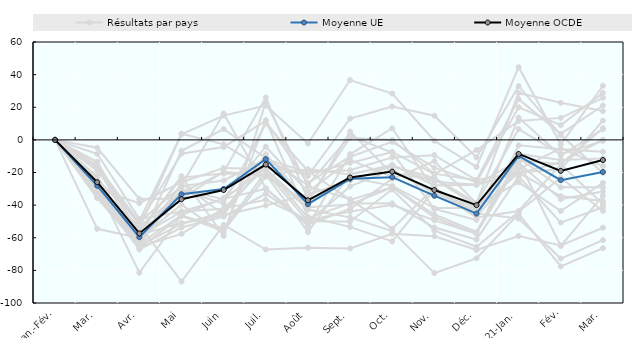
| Category | Australie | Canada | Royaume-Uni | États-Unis | Autriche | Bulgarie  | Chypre  | République tchèque  | Allemagne  | Danemark  | Estonie  | Grèce  | Espagne  | France  | Croatie  | Irlande  | Italie  | Lituanie  | Luxembourg  | Lettonie  | Pays-Bas  | Pologne  | Roumanie  | Slovénie  | Résultats par pays | Moyenne UE | Moyenne OCDE |
|---|---|---|---|---|---|---|---|---|---|---|---|---|---|---|---|---|---|---|---|---|---|---|---|---|---|---|---|
| 2020-Jan.-Fév. | 0 | 0 | 0 | 0 | 0 | 0 | 0 | 0 | 0 | 0 | 0 | 0 | 0 | 0 | 0 | 0 | 0 | 0 | 0 | 0 | 0 | 0 | 0 | 0 | 0 | 0 | 0 |
| Mar. | -8.517 | -15.927 | -13.625 | -4.853 | -32.585 | -22.38 | -16.806 | -30.191 | -16.004 | -18.932 | -33.764 | -30.013 | -33.271 | -24.479 | -28.477 | -32.853 | -31.774 | -35.192 | -30.586 | -29.103 | -17.11 | -13.515 | -23.129 | -54.517 | -35.642 | -28.111 | -25.951 |
| Avr. | -48.58 | -50.371 | -58.131 | -36.223 | -67.198 | -62.933 | -56.655 | -38.826 | -63.654 | -52.296 | -54.117 | -53.3 | -59.061 | -49.755 | -81.395 | -64.882 | -56.43 | -60.726 | -63.95 | -66.445 | -51.151 | -59.943 | -64.165 | -60.168 | -65.585 | -59.649 | -57.372 |
| Mai | -43.848 | -28.403 | -50.953 | -35.984 | -53.715 | -6.662 | -22.269 | -26.007 | -26.798 | -86.829 | 3.736 | -32.442 | -44.012 | 3.437 | -46.278 | -51.517 | -23.114 | -31.008 | -46.079 | -46.687 | -8.479 | -27.867 | -30.459 | -39.725 | -57.62 | -33.352 | -36.372 |
| Juin | -42.218 | -24.914 | -46.03 | -19.547 | -46.999 | 6.621 | -58.959 | -17.196 | -45.724 | -52.052 | -2.751 | -19.873 | -36.155 | 14.881 | -54.271 | -44.408 | -20.64 | -39.015 | -35.704 | -55.682 | -4.416 | 16.185 | -36.347 | -57.385 | -42.143 | -30.097 | -30.73 |
| Juil. | -16.625 | -11.821 | -40.209 | -21.936 | -33.049 | -11.21 | 23.074 | -17.871 | -13.402 | -67.199 | -18.763 | 26.004 | -29.991 | 21.038 | -19.646 | -8.775 | -21.155 | 10.041 | -4.182 | -22.529 | 11.688 | -29.68 | -17.164 | 12.038 | -36.726 | -11.784 | -15.125 |
| Août | -20.883 | -19.993 | -33.6 | -17.876 | -50.552 | -27.645 | -28.376 | -41.346 | -22.104 | -66.144 | -42.747 | -36.805 | -52.799 | -2.25 | -49.916 | -38.129 | -56.502 | -19.081 | -31.937 | -38.47 | -26.401 | -51.803 | -47.828 | -47.273 | -49.198 | -39.396 | -37.082 |
| Sept. | -14.131 | -18.555 | -24.805 | -21.29 | -28.525 | 2.462 | -36.384 | -39.587 | 13.005 | -66.517 | -47.499 | 1.282 | -8.835 | 36.664 | -50.093 | 5.123 | -20.875 | -36.779 | -12.423 | -23.054 | -10.349 | -42.394 | -38.948 | -53.334 | -43.987 | -23.859 | -23.044 |
| Oct. | -7.419 | -10.729 | -16.018 | -15.294 | -18.22 | -7.765 | -54.415 | -29.049 | 20.437 | -57.527 | -55.877 | -0.035 | 7.128 | 28.416 | -30.413 | -20.688 | -16.018 | -29.01 | -22.545 | -28.2 | -1.228 | -23.963 | -38.915 | -62.224 | -39.806 | -22.853 | -19.467 |
| Nov. | -20.921 | -9.358 | -25.618 | -27.918 | -32.558 | -42.283 | -29.359 | -47.55 | 14.779 | -59.081 | -81.663 | -20.718 | -30.244 | -0.524 | -55.62 | -24.145 | -23.347 | -45.762 | -34.431 | -41.826 | -17.06 | -13.055 | -53.742 | -30.774 | -49.321 | -34.204 | -30.76 |
| Déc. | -6.255 | -24.648 | -27.489 | -27.488 | -41.527 | -49.094 | -45.069 | -57.446 | -10.749 | -67.551 | -72.589 | -24.674 | -46.87 | -16.59 | -65.534 | -40.29 | -38.794 | -56.426 | -43.171 | -41.7 | -25.858 | -38.816 | -61.121 | -47.622 | -57.579 | -45.194 | -39.985 |
| 2021-Jan. | 11.641 | -19.971 | -20.256 | -12.595 | -8.591 | 13.641 | -48.244 | -14.237 | 32.941 | -58.913 | -45.298 | 24.976 | -17.914 | 44.579 | -44.021 | -25.984 | 6.612 | -11.118 | -20.189 | -13.138 | 19.976 | 28.735 | -22.377 | -43.571 | -3.366 | -9.786 | -8.623 |
| Fév. | 13.482 | -17.99 | -13.755 | -14.76 | -12.264 | -9.579 | -72.768 | -36.372 | 3.014 | -64.731 | -77.586 | 3.667 | -5.257 | -2.74 | -23.221 | -43.614 | -8.816 | -29.072 | -34.469 | -65.041 | 9.049 | 22.738 | -50.704 | -14.966 | -5.725 | -24.688 | -19.02 |
| Mar. | 25.803 | 11.802 | 0.071 | 7.196 | -11.35 | 6.57 | -61.489 | -31.627 | -20.284 | -53.855 | -66.392 | 21.09 | -16.123 | 33.189 | -43.571 | -26.343 | -0.644 | -29.094 | -37.508 | -34.161 | 28.811 | 17.645 | -41.267 | -39.384 | -7.284 | -19.67 | -12.364 |